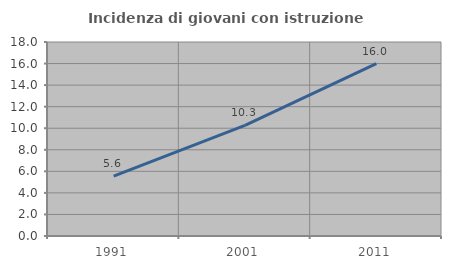
| Category | Incidenza di giovani con istruzione universitaria |
|---|---|
| 1991.0 | 5.556 |
| 2001.0 | 10.256 |
| 2011.0 | 16 |